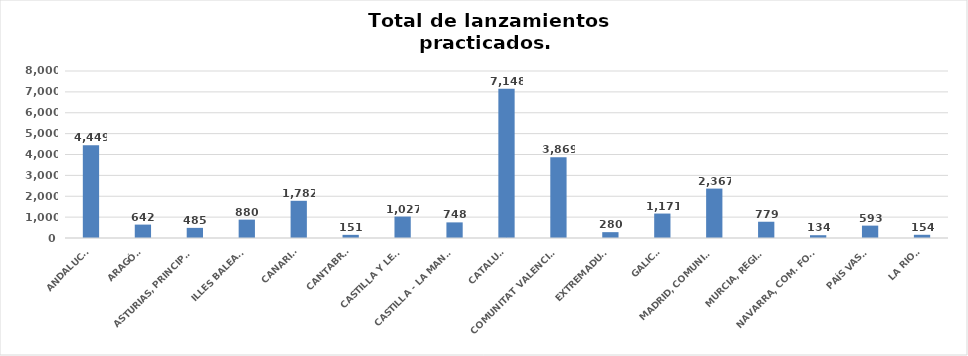
| Category | Series 0 |
|---|---|
| ANDALUCÍA | 4449 |
| ARAGÓN | 642 |
| ASTURIAS, PRINCIPADO | 485 |
| ILLES BALEARS | 880 |
| CANARIAS | 1782 |
| CANTABRIA | 151 |
| CASTILLA Y LEÓN | 1027 |
| CASTILLA - LA MANCHA | 748 |
| CATALUÑA | 7148 |
| COMUNITAT VALENCIANA | 3869 |
| EXTREMADURA | 280 |
| GALICIA | 1171 |
| MADRID, COMUNIDAD | 2367 |
| MURCIA, REGIÓN | 779 |
| NAVARRA, COM. FORAL | 134 |
| PAÍS VASCO | 593 |
| LA RIOJA | 154 |